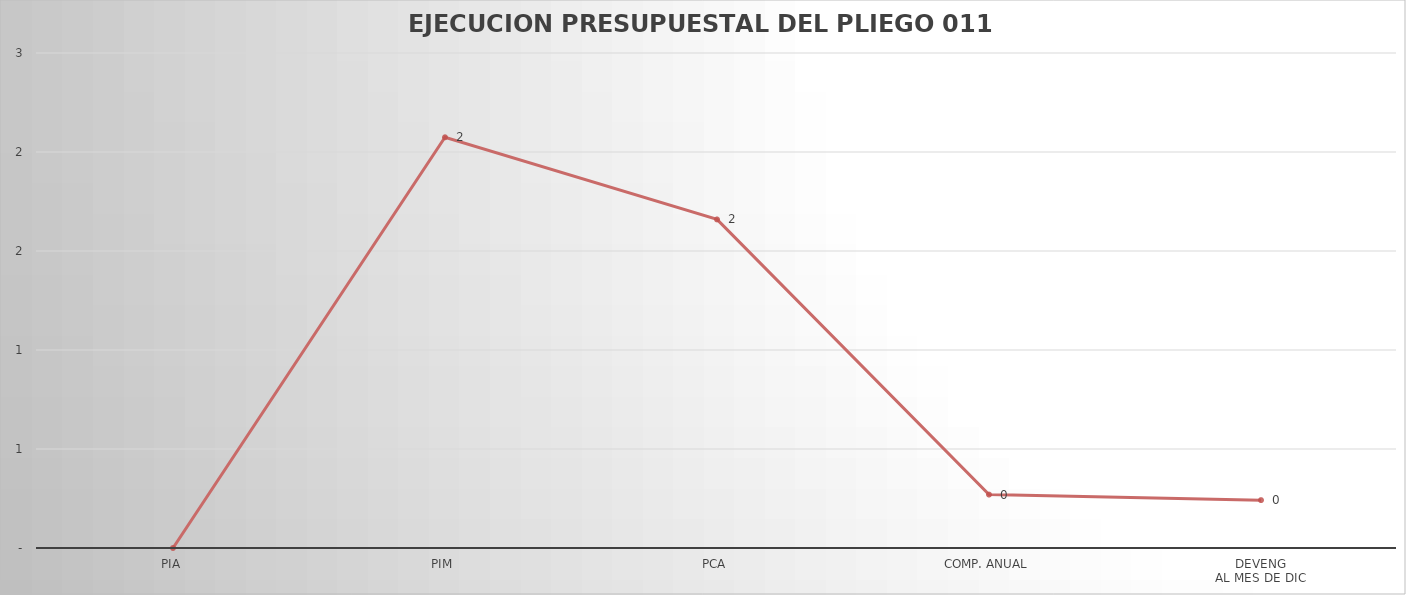
| Category | Series 0 |
|---|---|
| PIA | 0 |
| PIM | 2.074 |
| PCA | 1.659 |
| COMP. ANUAL | 0.27 |
| DEVENG
AL MES DE DIC | 0.242 |